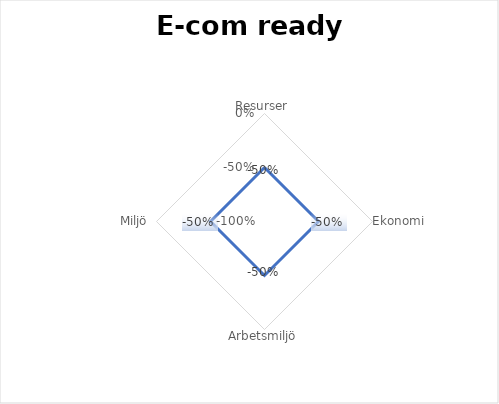
| Category | Skillnad % |
|---|---|
| Resurser | -0.5 |
| Ekonomi | -0.5 |
| Arbetsmiljö | -0.5 |
| Miljö  | -0.5 |